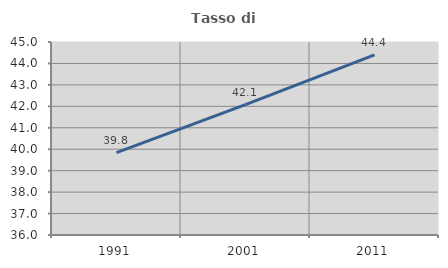
| Category | Tasso di occupazione   |
|---|---|
| 1991.0 | 39.841 |
| 2001.0 | 42.082 |
| 2011.0 | 44.404 |